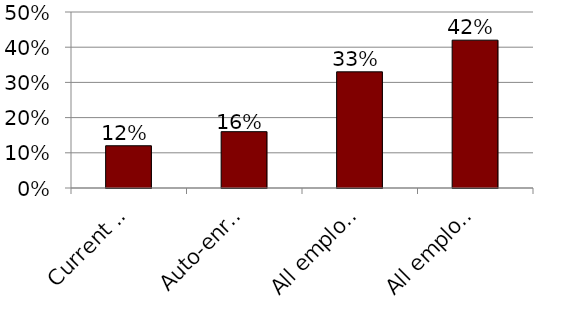
| Category | Series 0 |
|---|---|
| Current participation rate | 0.12 |
| Auto-enroll - all current plans | 0.16 |
| All employers offer plan | 0.33 |
| All employers offer plan + auto-enroll | 0.42 |